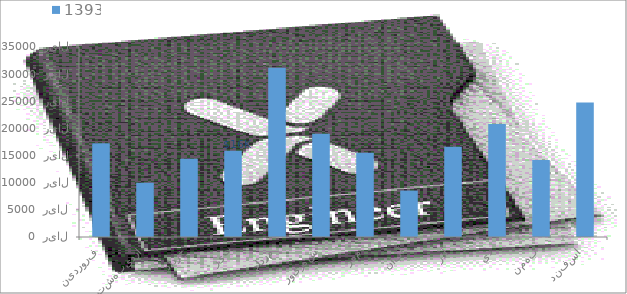
| Category | 1393 |
|---|---|
| فروردین | 17250 |
| اردیبهشت | 10000 |
| خرداد | 14400 |
| تیر | 15900 |
| مرداد | 31192.132 |
| شهریور | 19000 |
| مهر | 15509.093 |
| آبان | 8556.628 |
| آذر | 16642.791 |
| دی | 20826.606 |
| بهمن | 14189.465 |
| اسفند | 24764.858 |